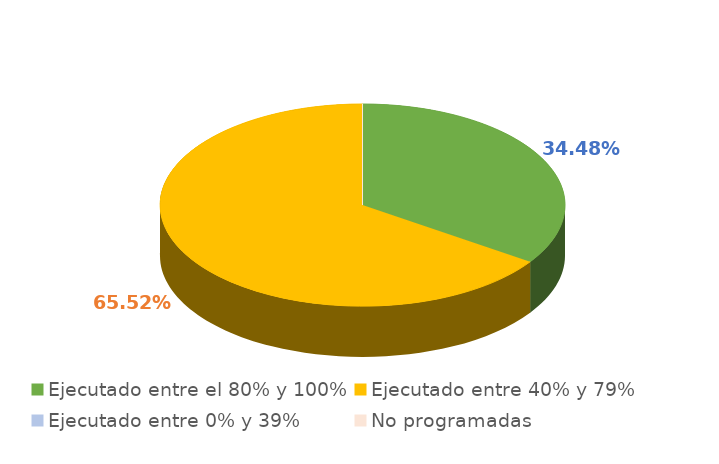
| Category | Series 0 |
|---|---|
| Ejecutado entre el 80% y 100% | 0.345 |
| Ejecutado entre 40% y 79% | 0.655 |
| Ejecutado entre 0% y 39% | 0 |
| No programadas | 0 |